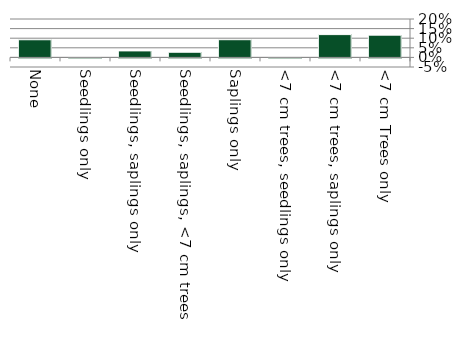
| Category | Non native |
|---|---|
| None | 0.092 |
| Seedlings only | 0 |
| Seedlings, saplings only | 0.034 |
| Seedlings, saplings, <7 cm trees | 0.027 |
| Saplings only | 0.092 |
| <7 cm trees, seedlings only | 0 |
| <7 cm trees, saplings only | 0.119 |
| <7 cm Trees only | 0.116 |